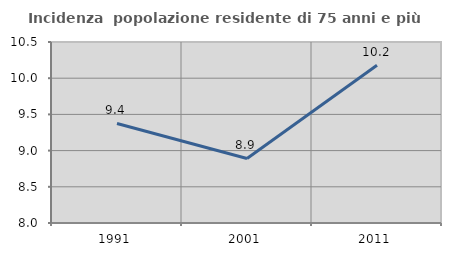
| Category | Incidenza  popolazione residente di 75 anni e più |
|---|---|
| 1991.0 | 9.375 |
| 2001.0 | 8.891 |
| 2011.0 | 10.179 |